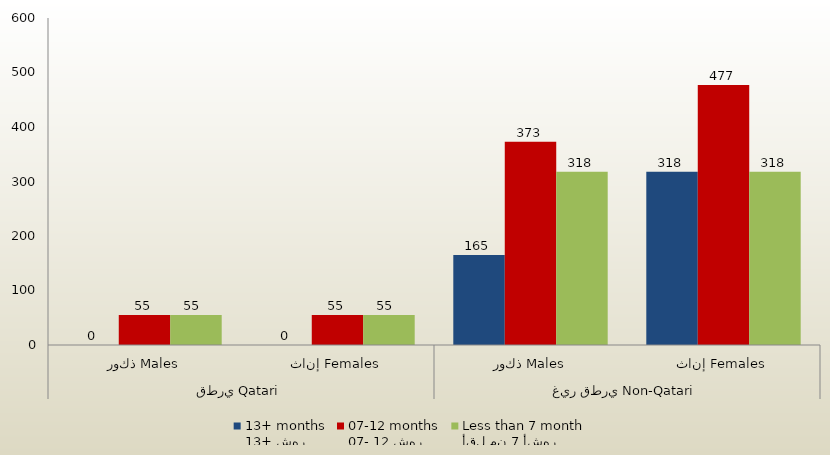
| Category | 13+ شهر
13+ months | 07- 12 شهر
07-12 months | أقل من 7 أشهر
Less than 7 month  |
|---|---|---|---|
| 0 | 0 | 55 | 55 |
| 1 | 0 | 55 | 55 |
| 2 | 165 | 373 | 318 |
| 3 | 318 | 477 | 318 |